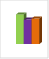
| Category | област Велико Търново |
|---|---|
| летен сезон 2019  | 165263 |
| летен сезон 2021  | 136718 |
| летен сезон 2022 г.  | 142266 |